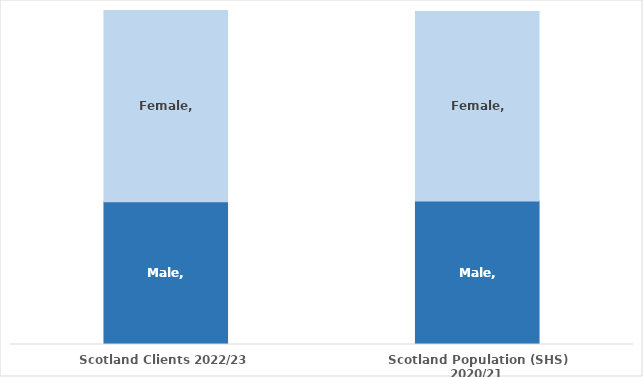
| Category | Male | Female |
|---|---|---|
| Scotland Clients 2022/23 | 0.428 | 0.572 |
| Scotland Population (SHS) 2020/21 | 0.43 | 0.567 |